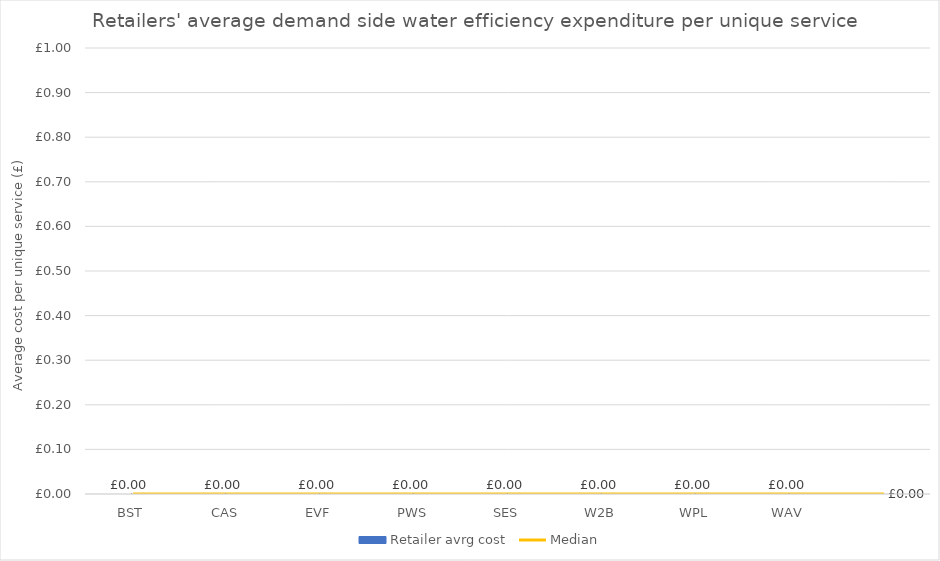
| Category | Retailer avrg cost |
|---|---|
| BST | 0 |
| CAS | 0 |
| EVF | 0 |
| PWS | 0 |
| SES | 0 |
| W2B | 0 |
| WPL | 0 |
| WAV | 0 |